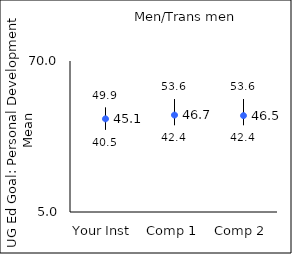
| Category | 25th percentile | 75th percentile | Mean |
|---|---|---|---|
| Your Inst | 40.5 | 49.9 | 45.1 |
| Comp 1 | 42.4 | 53.6 | 46.72 |
| Comp 2 | 42.4 | 53.6 | 46.48 |